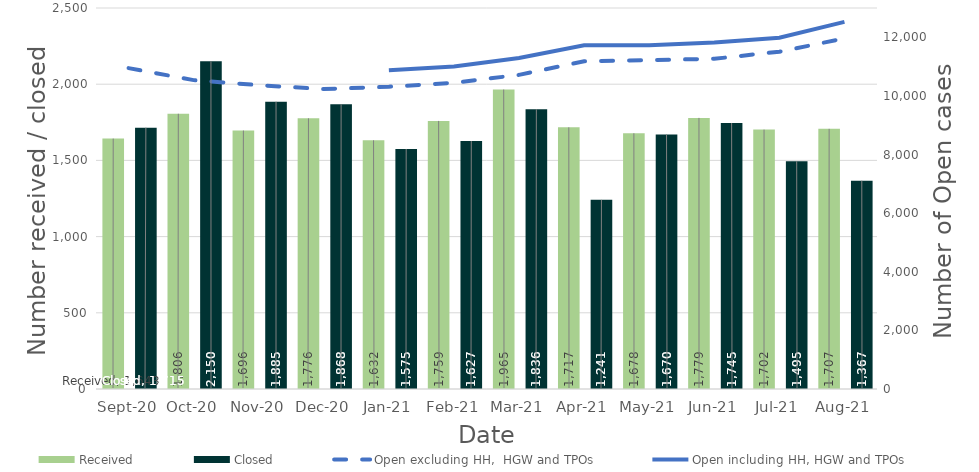
| Category | Received | Closed |
|---|---|---|
| 2020-09-01 | 1643 | 1715 |
| 2020-10-01 | 1806 | 2150 |
| 2020-11-01 | 1696 | 1885 |
| 2020-12-01 | 1776 | 1868 |
| 2021-01-01 | 1632 | 1575 |
| 2021-02-01 | 1759 | 1627 |
| 2021-03-01 | 1965 | 1836 |
| 2021-04-01 | 1717 | 1241 |
| 2021-05-01 | 1678 | 1670 |
| 2021-06-01 | 1779 | 1745 |
| 2021-07-01 | 1702 | 1495 |
| 2021-08-01 | 1707 | 1367 |